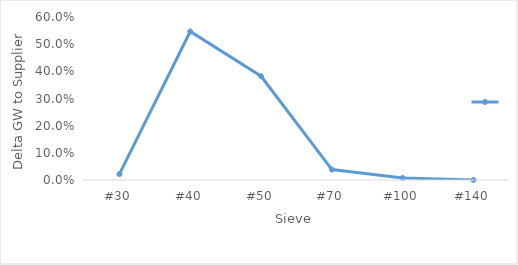
| Category | Series 0 |
|---|---|
| #30 | 0.022 |
| #40 | 0.547 |
| #50 | 0.382 |
| #70 | 0.038 |
| #100 | 0.008 |
| #140 | 0 |